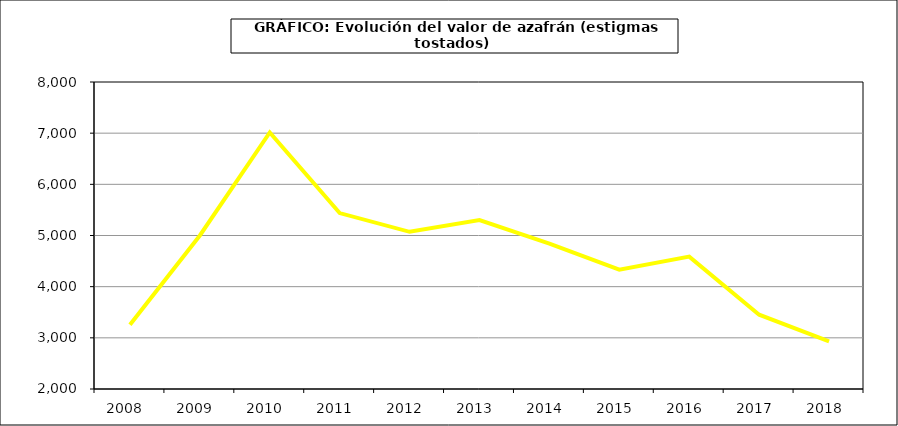
| Category | Valor |
|---|---|
| 2008.0 | 3257.208 |
| 2009.0 | 5000.541 |
| 2010.0 | 7014.469 |
| 2011.0 | 5438.177 |
| 2012.0 | 5071.99 |
| 2013.0 | 5302.253 |
| 2014.0 | 4841.325 |
| 2015.0 | 4331 |
| 2016.0 | 4587 |
| 2017.0 | 3451.991 |
| 2018.0 | 2929.42 |